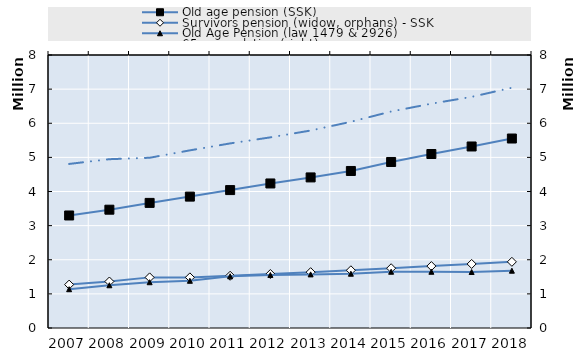
| Category | Old age pension (SSK) | Survivors pension (widow, orphans) - SSK |
|---|---|---|
| 2007.0 | 3297393 | 1271873 |
| 2008.0 | 3467017 | 1362588 |
| 2009.0 | 3665784 | 1483417 |
| 2010.0 | 3850199 | 1483417 |
| 2011.0 | 4041409 | 1531014 |
| 2012.0 | 4235496 | 1582401 |
| 2013.0 | 4412711 | 1635705 |
| 2014.0 | 4601192 | 1690968 |
| 2015.0 | 4865179 | 1751325 |
| 2016.0 | 5098801 | 1814407 |
| 2017.0 | 5319318 | 1876504 |
| 2018.0 | 5552281 | 1939548 |